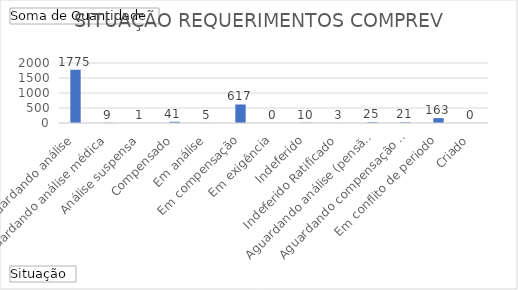
| Category | Total |
|---|---|
| Aguardando análise | 1775 |
| Aguardando análise médica | 9 |
| Análise suspensa | 1 |
| Compensado | 41 |
| Em análise | 5 |
| Em compensação | 617 |
| Em exigência | 0 |
| Indeferido | 10 |
| Indeferido Ratificado | 3 |
| Aguardando análise (pensão) | 25 |
| Aguardando compensação da aposentadoria (´pensão) | 21 |
| Em conflito de periodo | 163 |
| Criado | 0 |